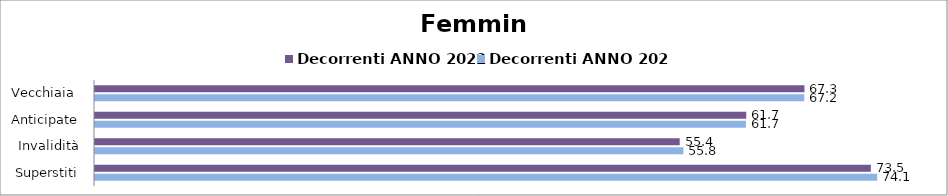
| Category | Decorrenti ANNO 2022 | Decorrenti ANNO 2023 |
|---|---|---|
| Vecchiaia  | 67.25 | 67.23 |
| Anticipate | 61.73 | 61.7 |
| Invalidità | 55.42 | 55.77 |
| Superstiti | 73.54 | 74.14 |